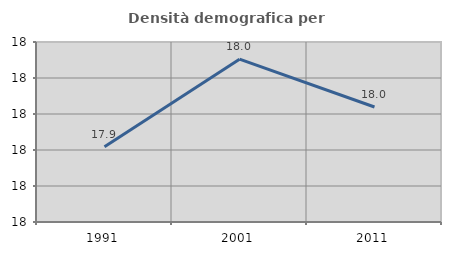
| Category | Densità demografica |
|---|---|
| 1991.0 | 17.904 |
| 2001.0 | 18.026 |
| 2011.0 | 17.96 |